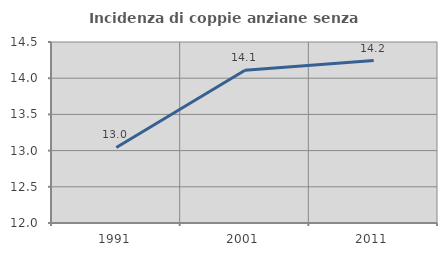
| Category | Incidenza di coppie anziane senza figli  |
|---|---|
| 1991.0 | 13.043 |
| 2001.0 | 14.11 |
| 2011.0 | 14.243 |